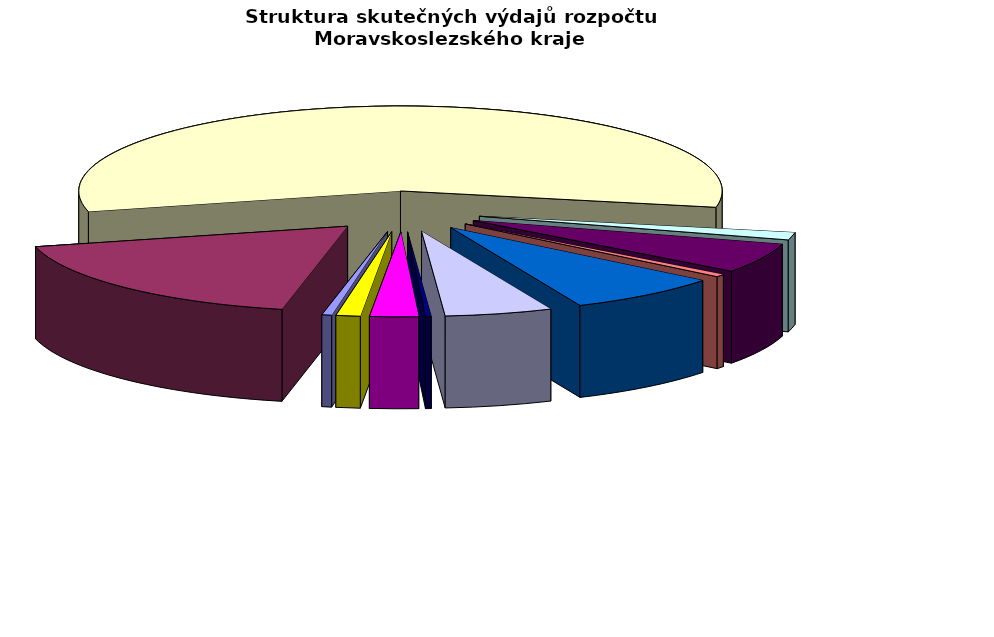
| Category | Series 0 |
|---|---|
| Regionální rozvoj | 102520.638 |
| Doprava | 3703631.543 |
| Školství | 11831940.616 |
| Kultura | 293797.016 |
| Zdravotnictví | 1179862.435 |
| Životní prostředí | 104008.065 |
| Sociální věci | 1607572.183 |
| Krizové řízení | 1123194.925 |
| Cestovní ruch | 59088.621 |
| Všeobecná veřejná správa a služby | 507481.099 |
| Ostatní | 253632.428 |